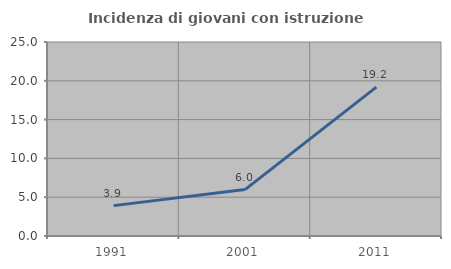
| Category | Incidenza di giovani con istruzione universitaria |
|---|---|
| 1991.0 | 3.913 |
| 2001.0 | 5.984 |
| 2011.0 | 19.189 |